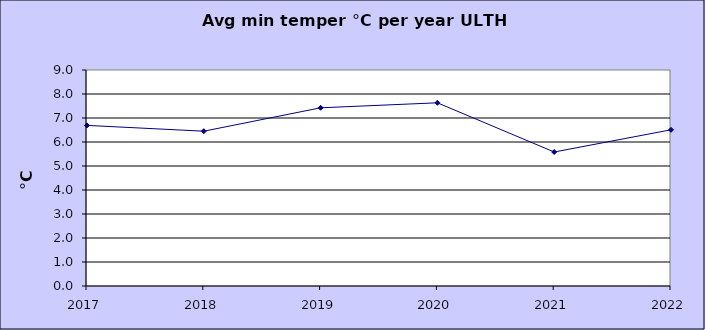
| Category | Series 0 |
|---|---|
| 2017.0 | 6.692 |
| 2018.0 | 6.45 |
| 2019.0 | 7.425 |
| 2020.0 | 7.633 |
| 2021.0 | 5.583 |
| 2022.0 | 6.508 |